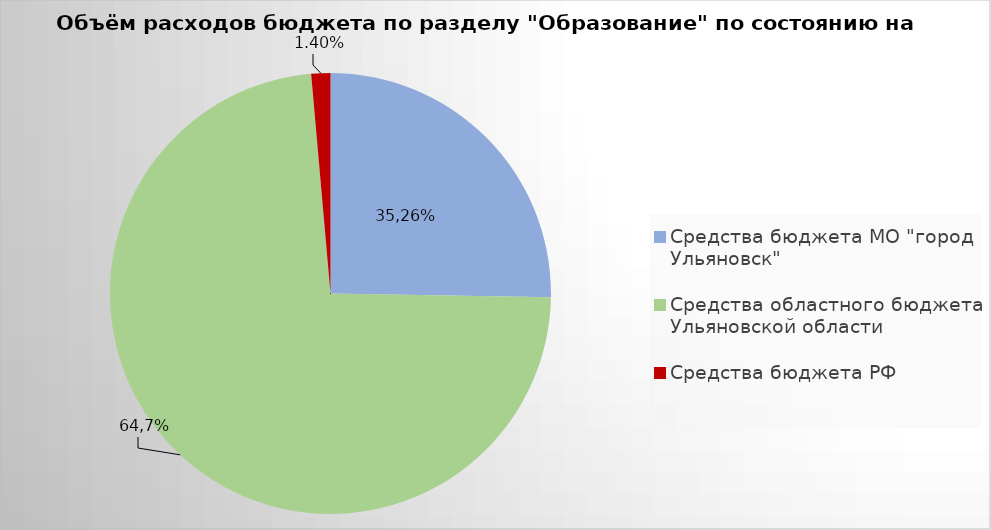
| Category | Series 0 |
|---|---|
| Средства бюджета МО "город Ульяновск" | 1675266.68 |
| Средства областного бюджета Ульяновской области | 4860526.59 |
| Средства бюджета РФ | 92823.5 |